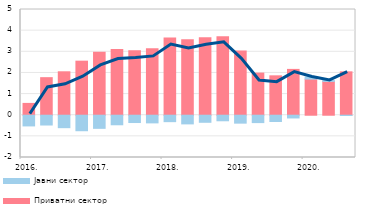
| Category | Приватни сектор | Јавни сектор |
|---|---|---|
| 2016. | 0.559 | -0.507 |
| II | 1.776 | -0.463 |
| III | 2.053 | -0.589 |
| IV | 2.556 | -0.733 |
| 2017. | 2.977 | -0.621 |
| II | 3.109 | -0.452 |
| III | 3.055 | -0.347 |
| IV | 3.145 | -0.363 |
| 2018. | 3.649 | -0.305 |
| II | 3.567 | -0.411 |
| III | 3.668 | -0.334 |
| IV | 3.71 | -0.263 |
| 2019. | 3.039 | -0.375 |
| II | 1.992 | -0.349 |
| III | 1.862 | -0.298 |
| IV | 2.168 | -0.13 |
| 2020. | 1.708 | 0.102 |
| II | 1.599 | 0.045 |
| III | 2.051 | -0.014 |